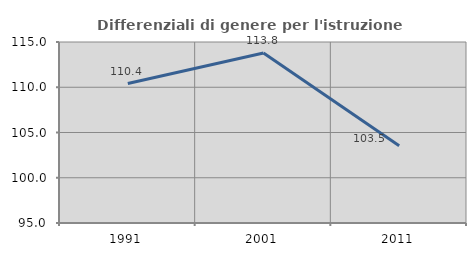
| Category | Differenziali di genere per l'istruzione superiore |
|---|---|
| 1991.0 | 110.405 |
| 2001.0 | 113.782 |
| 2011.0 | 103.545 |